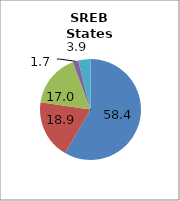
| Category | 50 states and D.C.2 |
|---|---|
| White | 58.439 |
| Black | 18.866 |
| Hispanic | 17.025 |
| Two or More Races | 1.736 |
| All Other1 | 3.933 |